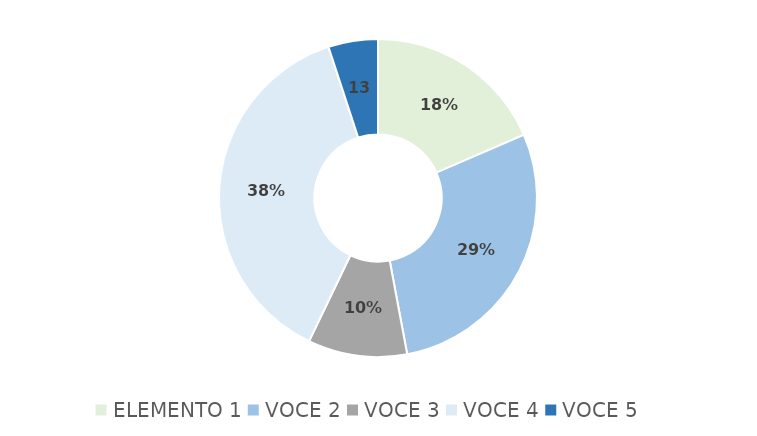
| Category | Series 0 |
|---|---|
| ELEMENTO 1 | 22 |
| VOCE 2 | 34 |
| VOCE 3 | 12 |
| VOCE 4 | 45 |
| VOCE 5 | 6 |